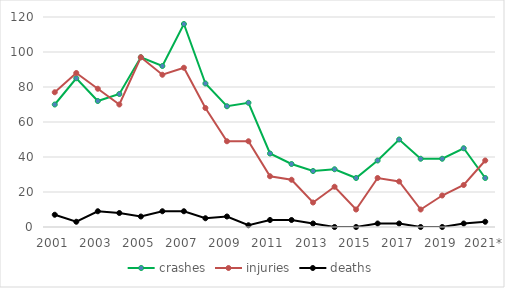
| Category | crashes | injuries | deaths |
|---|---|---|---|
| 2001 | 70 | 77 | 7 |
| 2002 | 85 | 88 | 3 |
| 2003 | 72 | 79 | 9 |
| 2004 | 76 | 70 | 8 |
| 2005 | 97 | 97 | 6 |
| 2006 | 92 | 87 | 9 |
| 2007 | 116 | 91 | 9 |
| 2008 | 82 | 68 | 5 |
| 2009 | 69 | 49 | 6 |
| 2010 | 71 | 49 | 1 |
| 2011 | 42 | 29 | 4 |
| 2012 | 36 | 27 | 4 |
| 2013 | 32 | 14 | 2 |
| 2014 | 33 | 23 | 0 |
| 2015 | 28 | 10 | 0 |
| 2016 | 38 | 28 | 2 |
| 2017 | 50 | 26 | 2 |
| 2018 | 39 | 10 | 0 |
| 2019 | 39 | 18 | 0 |
| 2020* | 45 | 24 | 2 |
| 2021* | 28 | 38 | 3 |